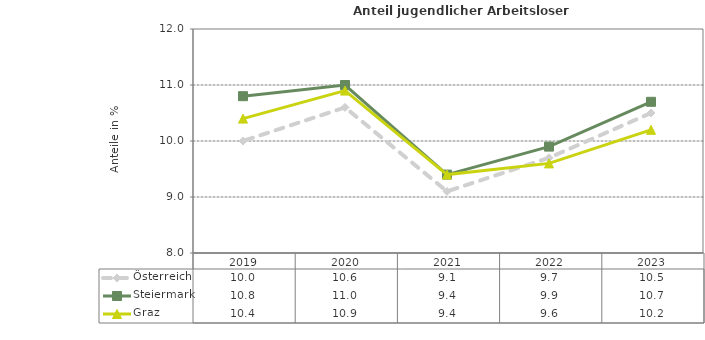
| Category | Österreich | Steiermark | Graz |
|---|---|---|---|
| 2023.0 | 10.5 | 10.7 | 10.2 |
| 2022.0 | 9.7 | 9.9 | 9.6 |
| 2021.0 | 9.1 | 9.4 | 9.4 |
| 2020.0 | 10.6 | 11 | 10.9 |
| 2019.0 | 10 | 10.8 | 10.4 |